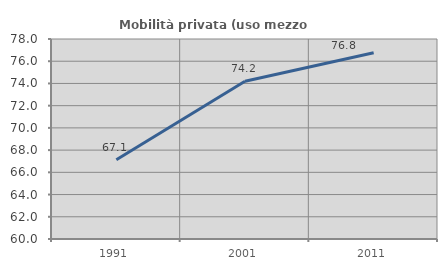
| Category | Mobilità privata (uso mezzo privato) |
|---|---|
| 1991.0 | 67.134 |
| 2001.0 | 74.195 |
| 2011.0 | 76.77 |